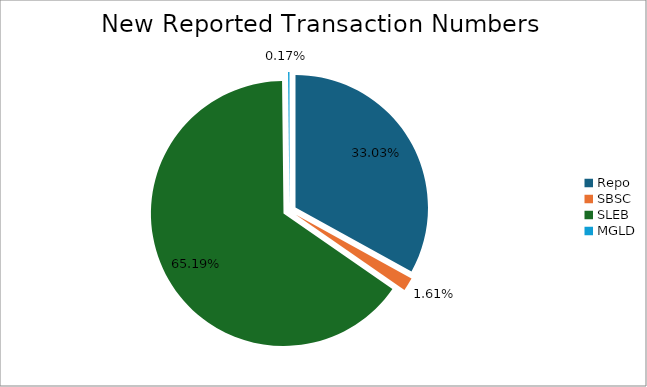
| Category | Series 0 |
|---|---|
| Repo | 435324 |
| SBSC | 21223 |
| SLEB | 859197 |
| MGLD | 2291 |